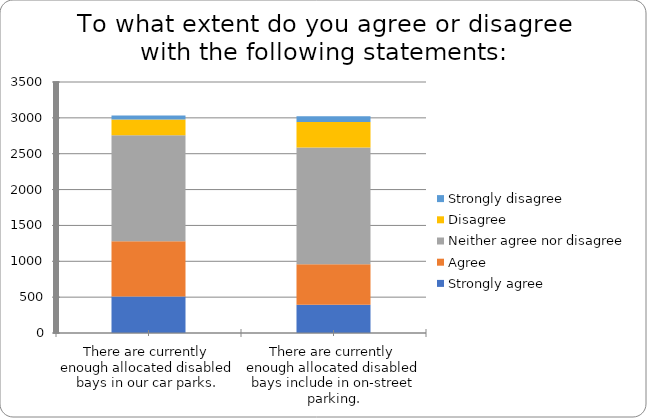
| Category | Strongly agree | Agree | Neither agree nor disagree | Disagree | Strongly disagree |
|---|---|---|---|---|---|
| There are currently enough allocated disabled bays in our car parks. | 509 | 770 | 1478 | 219 | 56 |
| There are currently enough allocated disabled bays include in on-street parking. | 395 | 564 | 1628 | 355 | 82 |